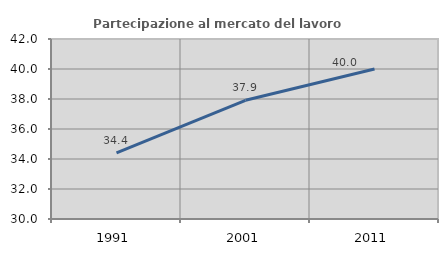
| Category | Partecipazione al mercato del lavoro  femminile |
|---|---|
| 1991.0 | 34.414 |
| 2001.0 | 37.914 |
| 2011.0 | 40 |